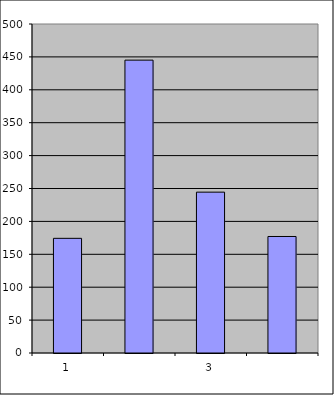
| Category | Series 0 |
|---|---|
| 0 | 174.25 |
| 1 | 445.082 |
| 2 | 244.461 |
| 3 | 177.07 |